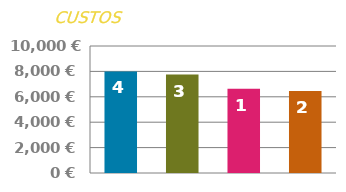
| Category | INICIAL |
|---|---|
| 0 | 8000 |
| 1 | 7750 |
| 2 | 6625 |
| 3 | 6450 |